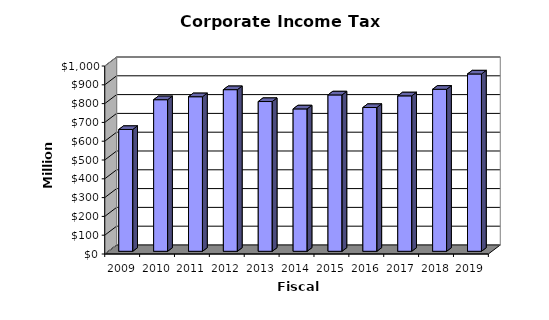
| Category | Amount |
|---|---|
| 2009.0 | 648032537 |
| 2010.0 | 806472760 |
| 2011.0 | 822258802.84 |
| 2012.0 | 859922839.55 |
| 2013.0 | 796728154.4 |
| 2014.0 | 757490742.09 |
| 2015.0 | 831906887.16 |
| 2016.0 | 764948013.77 |
| 2017.0 | 826960822.31 |
| 2018.0 | 861897138.18 |
| 2019.0 | 943390660.95 |